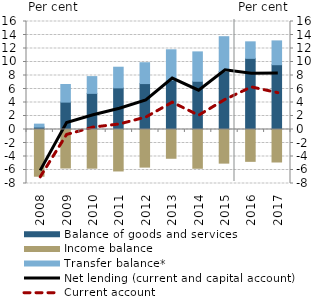
| Category | Balance of goods and services | Income balance | Transfer balance* |
|---|---|---|---|
| 2008.0 | 0.359 | -6.923 | 0.437 |
| 2009.0 | 4.056 | -5.703 | 2.608 |
| 2010.0 | 5.354 | -5.729 | 2.482 |
| 2011.0 | 6.167 | -6.144 | 3.061 |
| 2012.0 | 6.802 | -5.573 | 3.091 |
| 2013.0 | 7.295 | -4.262 | 4.514 |
| 2014.0 | 7.145 | -5.741 | 4.354 |
| 2015.0 | 8.593 | -4.983 | 5.155 |
| 2016.0 | 10.54 | -4.718 | 2.447 |
| 2017.0 | 9.597 | -4.814 | 3.53 |